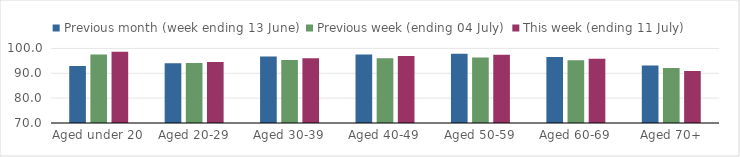
| Category | Previous month (week ending 13 June) | Previous week (ending 04 July) | This week (ending 11 July) |
|---|---|---|---|
| Aged under 20 | 92.95 | 97.555 | 98.643 |
| Aged 20-29 | 94.058 | 94.113 | 94.572 |
| Aged 30-39 | 96.792 | 95.353 | 96.019 |
| Aged 40-49 | 97.549 | 96.003 | 96.97 |
| Aged 50-59 | 97.811 | 96.338 | 97.442 |
| Aged 60-69 | 96.543 | 95.294 | 95.824 |
| Aged 70+ | 93.117 | 92.079 | 90.955 |